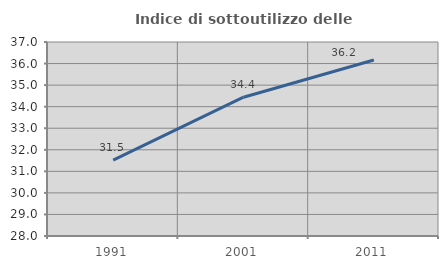
| Category | Indice di sottoutilizzo delle abitazioni  |
|---|---|
| 1991.0 | 31.524 |
| 2001.0 | 34.439 |
| 2011.0 | 36.168 |